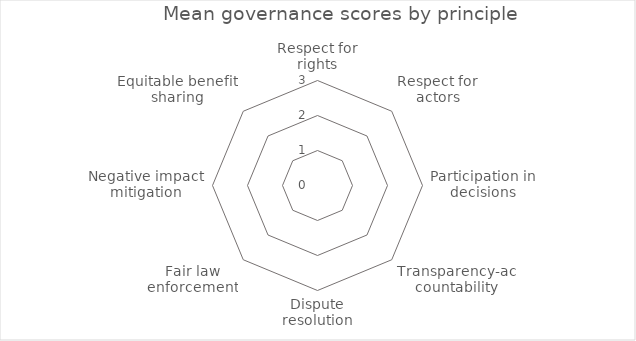
| Category | Mean |
|---|---|
| Respect for rights | 0 |
| Respect for actors | 0 |
| Participation in decisions | 0 |
| Transparency-accountability | 0 |
| Dispute resolution | 0 |
| Fair law enforcement | 0 |
| Negative impact mitigation | 0 |
| Equitable benefit sharing | 0 |